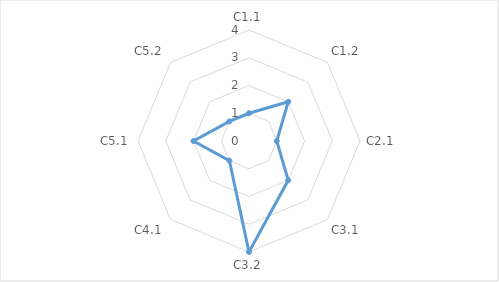
| Category | Series 0 | "" | 1 | 2 | 3 | 4 |
|---|---|---|---|---|---|---|
| C1.1 | 1 |  |  |  |  |  |
| C1.2 | 2 |  |  |  |  |  |
| C2.1 | 1 |  |  |  |  |  |
| C3.1 | 2 |  |  |  |  |  |
| C3.2 | 4 |  |  |  |  |  |
| C4.1 | 1 |  |  |  |  |  |
| C5.1 | 2 |  |  |  |  |  |
| C5.2 | 1 |  |  |  |  |  |